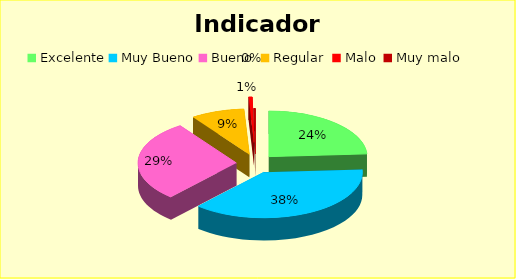
| Category | Series 0 |
|---|---|
| Excelente | 0.24 |
| Muy Bueno | 0.375 |
| Bueno  | 0.287 |
| Regular  | 0.088 |
| Malo  | 0.006 |
| Muy malo  | 0.003 |